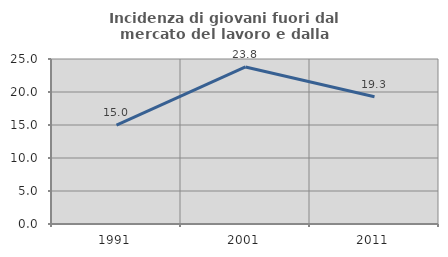
| Category | Incidenza di giovani fuori dal mercato del lavoro e dalla formazione  |
|---|---|
| 1991.0 | 14.984 |
| 2001.0 | 23.79 |
| 2011.0 | 19.277 |